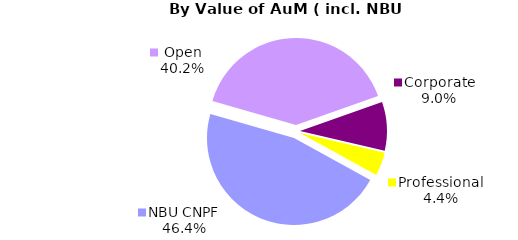
| Category | Series 0 |
|---|---|
| Open | 1354.582 |
| Corporate | 304.857 |
| Professional | 146.879 |
| NBU CNPF | 1566.712 |